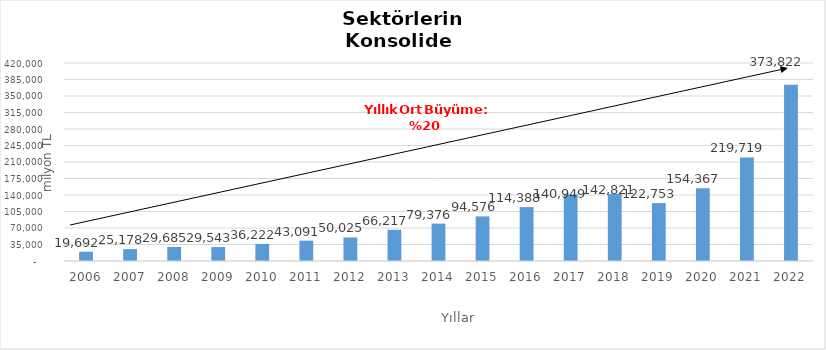
| Category | Toplam |
|---|---|
| 2006.0 | 19691.807 |
| 2007.0 | 25178.471 |
| 2008.0 | 29685 |
| 2009.0 | 29543.192 |
| 2010.0 | 36222.019 |
| 2011.0 | 43090.622 |
| 2012.0 | 50025.409 |
| 2013.0 | 66217.364 |
| 2014.0 | 79376 |
| 2015.0 | 94576 |
| 2016.0 | 114388 |
| 2017.0 | 140949 |
| 2018.0 | 142821 |
| 2019.0 | 122753 |
| 2020.0 | 154367 |
| 2021.0 | 219719 |
| 2022.0 | 373822 |